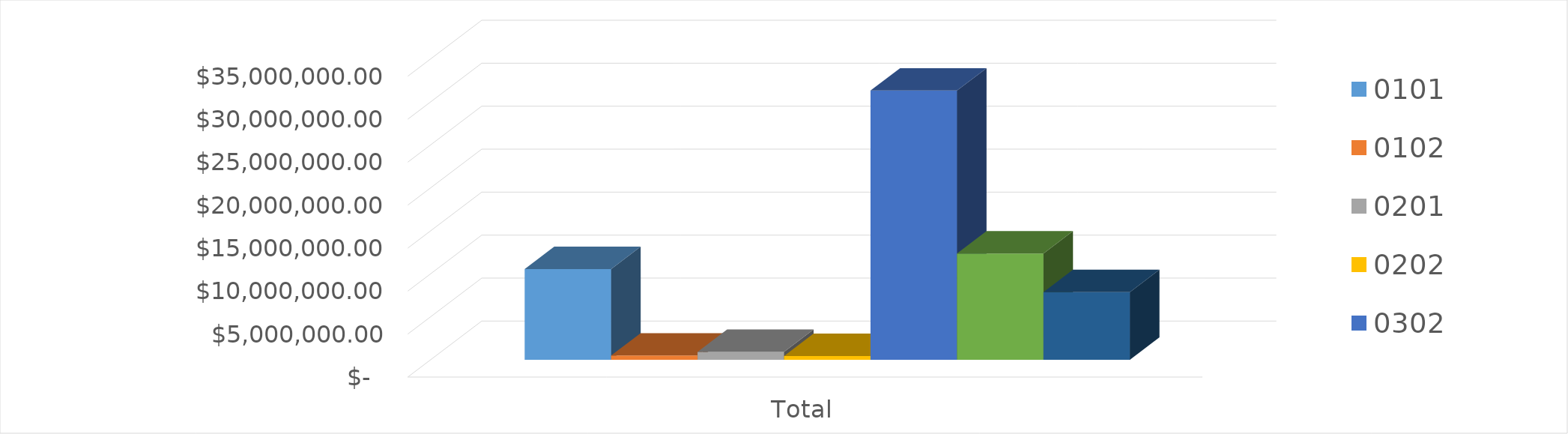
| Category | 0101 | 0102 | 0201 | 0202 | 0302 | 0001 | 0002 |
|---|---|---|---|---|---|---|---|
| Total | 10555308.01 | 485358.972 | 912680 | 439364.93 | 31317458.54 | 12360885.05 | 7867390.06 |